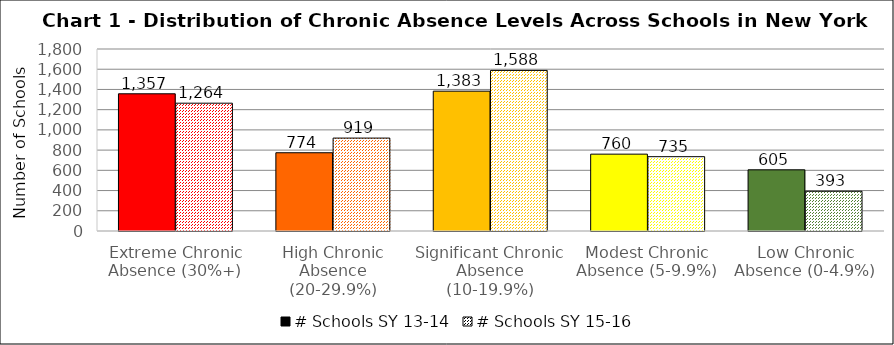
| Category | # Schools SY 13-14 | # Schools SY 15-16 |
|---|---|---|
| Extreme Chronic Absence (30%+) | 1357 | 1264 |
| High Chronic Absence (20-29.9%) | 774 | 919 |
| Significant Chronic Absence (10-19.9%) | 1383 | 1588 |
| Modest Chronic Absence (5-9.9%) | 760 | 735 |
| Low Chronic Absence (0-4.9%) | 605 | 393 |